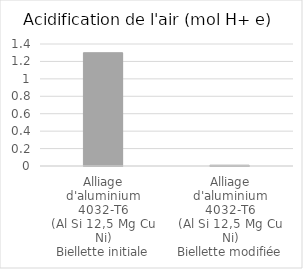
| Category | Series 0 |
|---|---|
| Alliage
d'aluminium
4032-T6
(Al Si 12,5 Mg Cu Ni)
Biellette initiale | 1.3 |
| Alliage
d'aluminium
4032-T6
(Al Si 12,5 Mg Cu Ni)
Biellette modifiée | 0.009 |